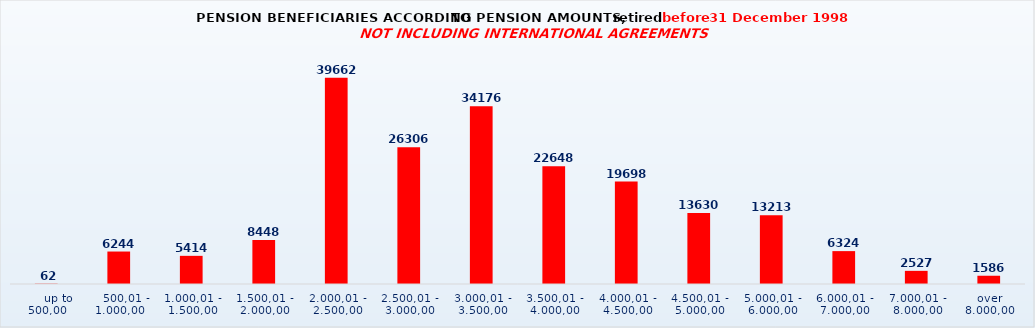
| Category | Series 0 |
|---|---|
|      up to 500,00 | 62 |
|    500,01 - 1.000,00 | 6244 |
| 1.000,01 - 1.500,00 | 5414 |
| 1.500,01 - 2.000,00 | 8448 |
| 2.000,01 - 2.500,00 | 39662 |
| 2.500,01 - 3.000,00 | 26306 |
| 3.000,01 - 3.500,00 | 34176 |
| 3.500,01 - 4.000,00 | 22648 |
| 4.000,01 - 4.500,00 | 19698 |
| 4.500,01 - 5.000,00 | 13630 |
| 5.000,01 - 6.000,00 | 13213 |
| 6.000,01 - 7.000,00 | 6324 |
| 7.000,01 - 8.000,00 | 2527 |
| over 8.000,00 | 1586 |